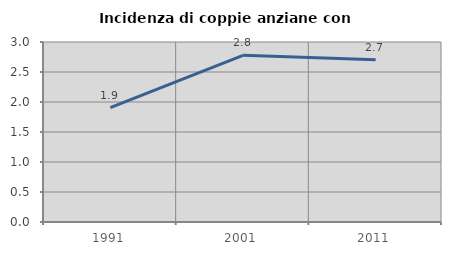
| Category | Incidenza di coppie anziane con figli |
|---|---|
| 1991.0 | 1.905 |
| 2001.0 | 2.778 |
| 2011.0 | 2.703 |